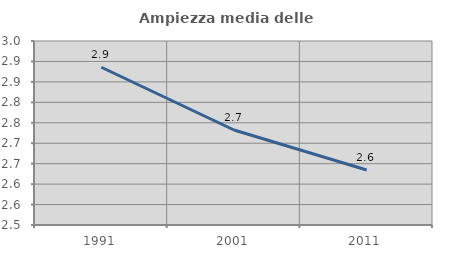
| Category | Ampiezza media delle famiglie |
|---|---|
| 1991.0 | 2.886 |
| 2001.0 | 2.732 |
| 2011.0 | 2.635 |